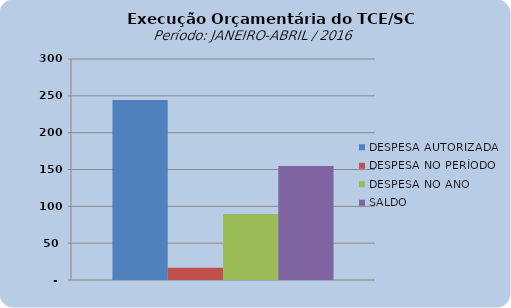
| Category | DESPESA AUTORIZADA | DESPESA NO PERÍODO | DESPESA NO ANO | SALDO |
|---|---|---|---|---|
| 0 | 244221539.02 | 16677198.99 | 89531924.81 | 154689614.21 |